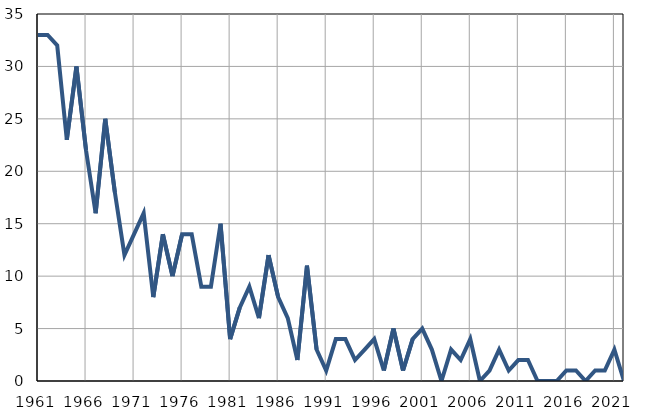
| Category | Infants
deaths |
|---|---|
| 1961.0 | 33 |
| 1962.0 | 33 |
| 1963.0 | 32 |
| 1964.0 | 23 |
| 1965.0 | 30 |
| 1966.0 | 22 |
| 1967.0 | 16 |
| 1968.0 | 25 |
| 1969.0 | 18 |
| 1970.0 | 12 |
| 1971.0 | 14 |
| 1972.0 | 16 |
| 1973.0 | 8 |
| 1974.0 | 14 |
| 1975.0 | 10 |
| 1976.0 | 14 |
| 1977.0 | 14 |
| 1978.0 | 9 |
| 1979.0 | 9 |
| 1980.0 | 15 |
| 1981.0 | 4 |
| 1982.0 | 7 |
| 1983.0 | 9 |
| 1984.0 | 6 |
| 1985.0 | 12 |
| 1986.0 | 8 |
| 1987.0 | 6 |
| 1988.0 | 2 |
| 1989.0 | 11 |
| 1990.0 | 3 |
| 1991.0 | 1 |
| 1992.0 | 4 |
| 1993.0 | 4 |
| 1994.0 | 2 |
| 1995.0 | 3 |
| 1996.0 | 4 |
| 1997.0 | 1 |
| 1998.0 | 5 |
| 1999.0 | 1 |
| 2000.0 | 4 |
| 2001.0 | 5 |
| 2002.0 | 3 |
| 2003.0 | 0 |
| 2004.0 | 3 |
| 2005.0 | 2 |
| 2006.0 | 4 |
| 2007.0 | 0 |
| 2008.0 | 1 |
| 2009.0 | 3 |
| 2010.0 | 1 |
| 2011.0 | 2 |
| 2012.0 | 2 |
| 2013.0 | 0 |
| 2014.0 | 0 |
| 2015.0 | 0 |
| 2016.0 | 1 |
| 2017.0 | 1 |
| 2018.0 | 0 |
| 2019.0 | 1 |
| 2020.0 | 1 |
| 2021.0 | 3 |
| 2022.0 | 0 |